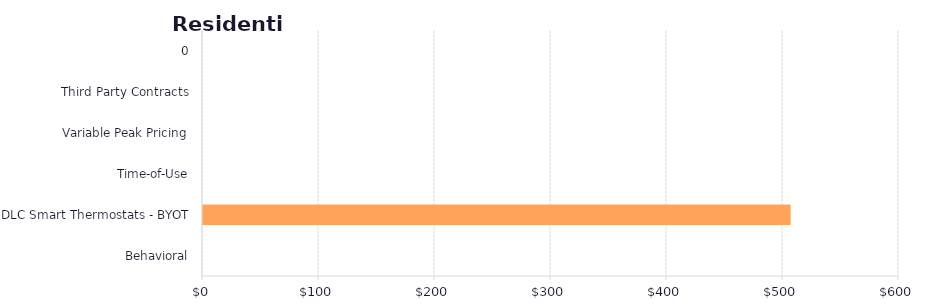
| Category | Series 1 |
|---|---|
| Behavioral | 0 |
| DLC Smart Thermostats - BYOT | 506.576 |
| Time-of-Use | 0 |
| Variable Peak Pricing | 0 |
| Third Party Contracts | 0 |
| 0 | 0 |